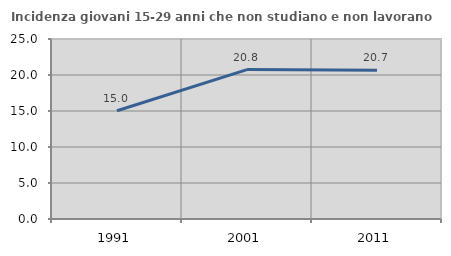
| Category | Incidenza giovani 15-29 anni che non studiano e non lavorano  |
|---|---|
| 1991.0 | 15.033 |
| 2001.0 | 20.75 |
| 2011.0 | 20.675 |